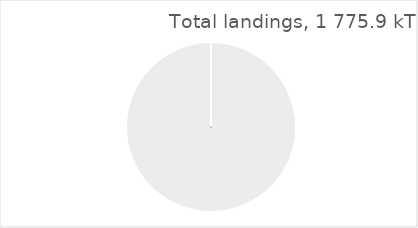
| Category | Total landings (kT)** |
|---|---|
| 0 | 1775.868 |